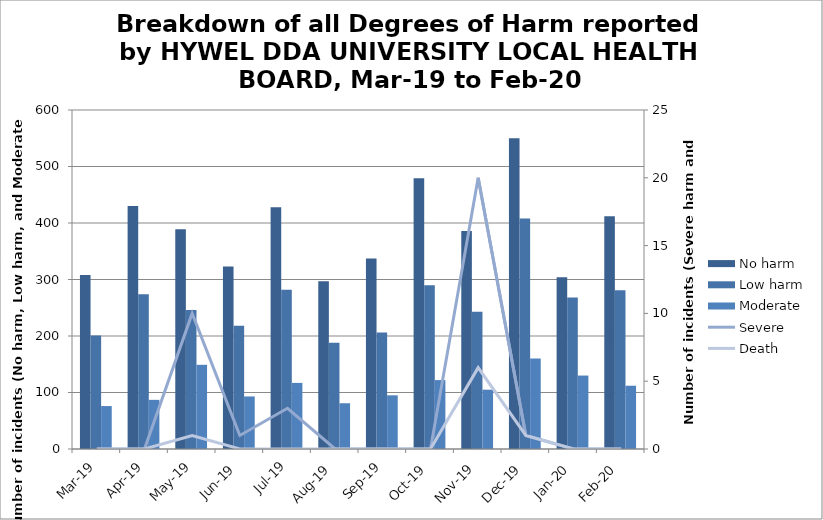
| Category | No harm | Low harm | Moderate |
|---|---|---|---|
| Mar-19 | 308 | 201 | 76 |
| Apr-19 | 430 | 274 | 87 |
| May-19 | 389 | 246 | 149 |
| Jun-19 | 323 | 218 | 93 |
| Jul-19 | 428 | 282 | 117 |
| Aug-19 | 297 | 188 | 81 |
| Sep-19 | 337 | 206 | 95 |
| Oct-19 | 479 | 290 | 122 |
| Nov-19 | 386 | 243 | 105 |
| Dec-19 | 550 | 408 | 160 |
| Jan-20 | 304 | 268 | 130 |
| Feb-20 | 412 | 281 | 112 |